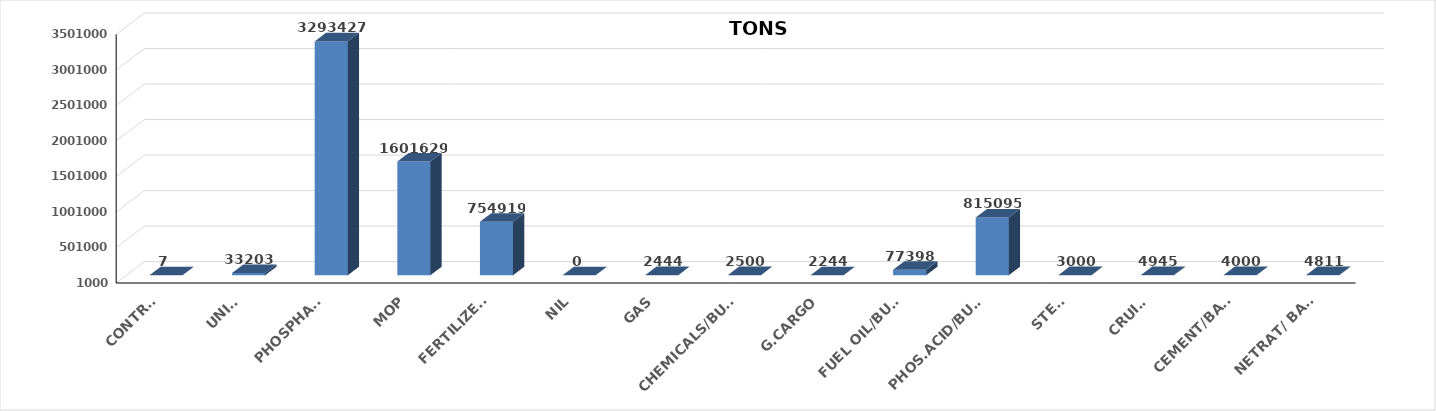
| Category | Series 0 |
|---|---|
| CONTRS. | 7 |
| UNITS | 33203 |
| PHOSPHATE | 3293427 |
| MOP | 1601629 |
| FERTILIZERS | 754919 |
| NIL | 0 |
| GAS | 2444 |
| CHEMICALS/BULK | 2500 |
| G.CARGO | 2244 |
| FUEL OIL/BULK | 77398 |
| PHOS.ACID/BULK | 815095 |
| STEEL | 3000 |
| CRUISE | 4945 |
| CEMENT/BAGS | 4000 |
| NETRAT/ BAGS | 4811 |